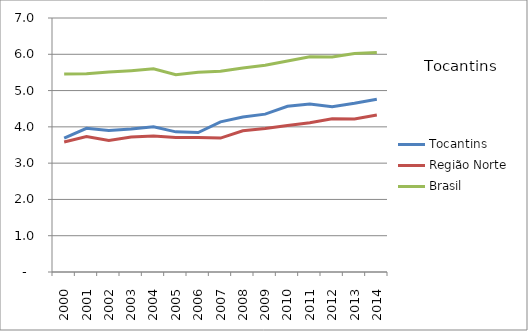
| Category | Tocantins | Região Norte | Brasil |
|---|---|---|---|
| 2000.0 | 3.687 | 3.584 | 5.458 |
| 2001.0 | 3.96 | 3.732 | 5.467 |
| 2002.0 | 3.899 | 3.625 | 5.513 |
| 2003.0 | 3.942 | 3.72 | 5.549 |
| 2004.0 | 4 | 3.745 | 5.599 |
| 2005.0 | 3.862 | 3.709 | 5.438 |
| 2006.0 | 3.844 | 3.704 | 5.507 |
| 2007.0 | 4.136 | 3.69 | 5.531 |
| 2008.0 | 4.269 | 3.894 | 5.623 |
| 2009.0 | 4.351 | 3.953 | 5.699 |
| 2010.0 | 4.566 | 4.037 | 5.816 |
| 2011.0 | 4.627 | 4.116 | 5.93 |
| 2012.0 | 4.553 | 4.224 | 5.928 |
| 2013.0 | 4.648 | 4.216 | 6.021 |
| 2014.0 | 4.761 | 4.325 | 6.051 |